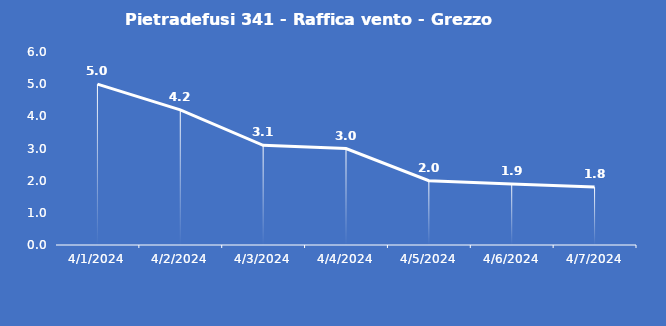
| Category | Pietradefusi 341 - Raffica vento - Grezzo (m/s) |
|---|---|
| 4/1/24 | 5 |
| 4/2/24 | 4.2 |
| 4/3/24 | 3.1 |
| 4/4/24 | 3 |
| 4/5/24 | 2 |
| 4/6/24 | 1.9 |
| 4/7/24 | 1.8 |